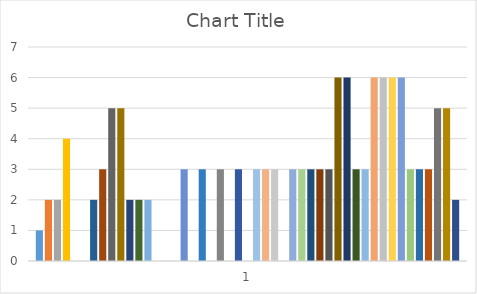
| Category | Series 0 | Series 1 | Series 2 | Series 3 | Series 4 | Series 5 | Series 6 | Series 7 | Series 8 | Series 9 | Series 10 | Series 11 | Series 12 | Series 13 | Series 14 | Series 15 | Series 16 | Series 17 | Series 18 | Series 19 | Series 20 | Series 21 | Series 22 | Series 23 | Series 24 | Series 25 | Series 26 | Series 27 | Series 28 | Series 29 | Series 30 | Series 31 | Series 32 | Series 33 | Series 34 | Series 35 | Series 36 | Series 37 | Series 38 | Series 39 | Series 40 | Series 41 | Series 42 | Series 43 | Series 44 | Series 45 | Series 46 |
|---|---|---|---|---|---|---|---|---|---|---|---|---|---|---|---|---|---|---|---|---|---|---|---|---|---|---|---|---|---|---|---|---|---|---|---|---|---|---|---|---|---|---|---|---|---|---|---|
| 0 | 1 | 2 | 2 | 4 | 0 | 0 | 2 | 3 | 5 | 5 | 2 | 2 | 2 | 0 | 0 | 0 | 3 | 0 | 3 | 0 | 3 | 0 | 3 | 0 | 3 | 3 | 3 | 0 | 3 | 3 | 3 | 3 | 3 | 6 | 6 | 3 | 3 | 6 | 6 | 6 | 6 | 3 | 3 | 3 | 5 | 5 | 2 |